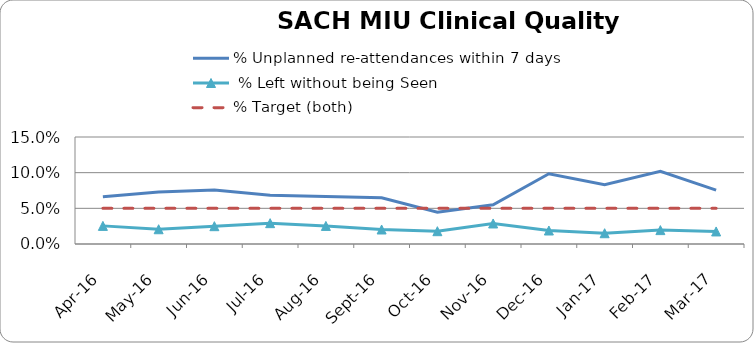
| Category | % Unplanned re-attendances within 7 days | % Left without being Seen | % Target (both) |
|---|---|---|---|
| 2016-04-01 | 0.066 | 0.025 |  |
| 2016-05-01 | 0.073 | 0.021 |  |
| 2016-06-01 | 0.076 | 0.025 |  |
| 2016-07-01 | 0.068 | 0.029 |  |
| 2016-08-01 | 0.067 | 0.025 |  |
| 2016-09-01 | 0.065 | 0.02 |  |
| 2016-10-01 | 0.044 | 0.018 |  |
| 2016-11-01 | 0.055 | 0.029 |  |
| 2016-12-01 | 0.099 | 0.019 |  |
| 2017-01-01 | 0.083 | 0.015 |  |
| 2017-02-01 | 0.102 | 0.019 |  |
| 2017-03-01 | 0.076 | 0.018 |  |